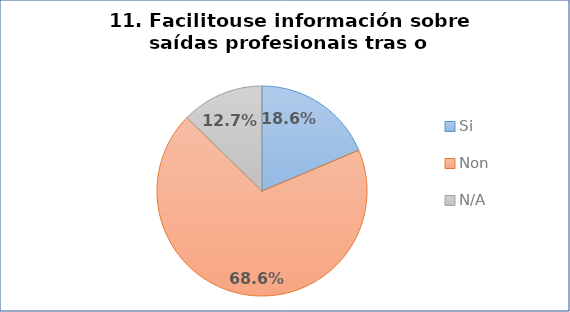
| Category | Pregunta 11. Facilitouse información sobre saídas profesionais tras o doutoramento |
|---|---|
| Si | 0.186 |
| Non | 0.686 |
| N/A | 0.127 |